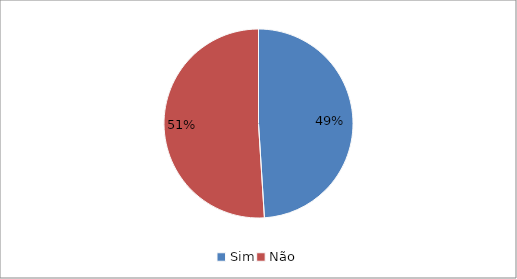
| Category | Series 0 |
|---|---|
| Sim | 0.49 |
| Não | 0.51 |